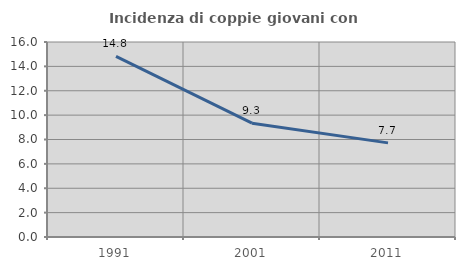
| Category | Incidenza di coppie giovani con figli |
|---|---|
| 1991.0 | 14.815 |
| 2001.0 | 9.339 |
| 2011.0 | 7.722 |